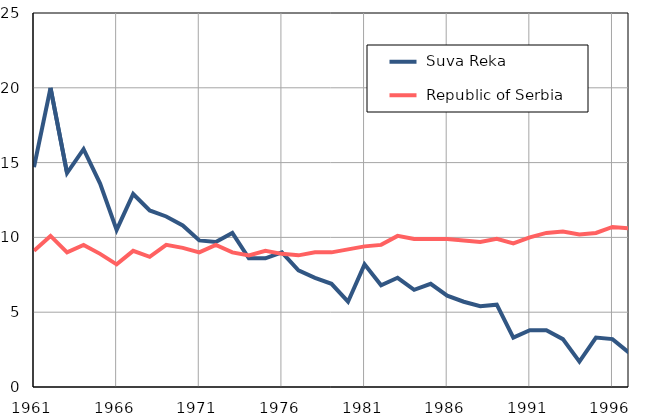
| Category |  Suva Reka |  Republic of Serbia |
|---|---|---|
| 1961.0 | 14.7 | 9.1 |
| 1962.0 | 20 | 10.1 |
| 1963.0 | 14.3 | 9 |
| 1964.0 | 15.9 | 9.5 |
| 1965.0 | 13.6 | 8.9 |
| 1966.0 | 10.5 | 8.2 |
| 1967.0 | 12.9 | 9.1 |
| 1968.0 | 11.8 | 8.7 |
| 1969.0 | 11.4 | 9.5 |
| 1970.0 | 10.8 | 9.3 |
| 1971.0 | 9.8 | 9 |
| 1972.0 | 9.7 | 9.5 |
| 1973.0 | 10.3 | 9 |
| 1974.0 | 8.6 | 8.8 |
| 1975.0 | 8.6 | 9.1 |
| 1976.0 | 9 | 8.9 |
| 1977.0 | 7.8 | 8.8 |
| 1978.0 | 7.3 | 9 |
| 1979.0 | 6.9 | 9 |
| 1980.0 | 5.7 | 9.2 |
| 1981.0 | 8.2 | 9.4 |
| 1982.0 | 6.8 | 9.5 |
| 1983.0 | 7.3 | 10.1 |
| 1984.0 | 6.5 | 9.9 |
| 1985.0 | 6.9 | 9.9 |
| 1986.0 | 6.1 | 9.9 |
| 1987.0 | 5.7 | 9.8 |
| 1988.0 | 5.4 | 9.7 |
| 1989.0 | 5.5 | 9.9 |
| 1990.0 | 3.3 | 9.6 |
| 1991.0 | 3.8 | 10 |
| 1992.0 | 3.8 | 10.3 |
| 1993.0 | 3.2 | 10.4 |
| 1994.0 | 1.7 | 10.2 |
| 1995.0 | 3.3 | 10.3 |
| 1996.0 | 3.2 | 10.7 |
| 1997.0 | 2.3 | 10.6 |